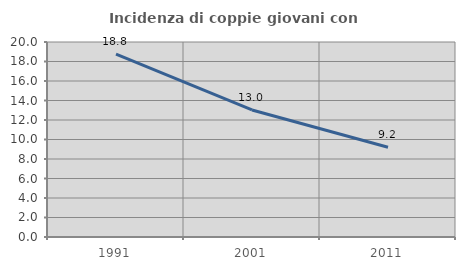
| Category | Incidenza di coppie giovani con figli |
|---|---|
| 1991.0 | 18.759 |
| 2001.0 | 13.03 |
| 2011.0 | 9.199 |